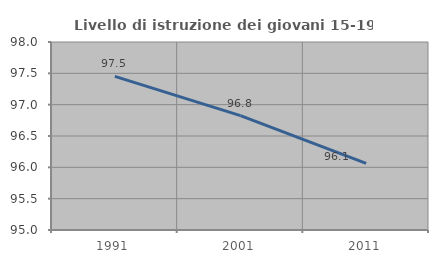
| Category | Livello di istruzione dei giovani 15-19 anni |
|---|---|
| 1991.0 | 97.452 |
| 2001.0 | 96.825 |
| 2011.0 | 96.063 |